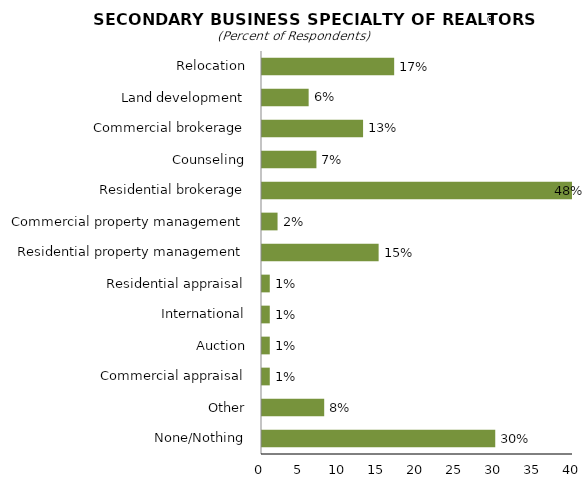
| Category | Series 0 |
|---|---|
| Relocation | 17 |
| Land development | 6 |
| Commercial brokerage | 13 |
| Counseling | 7 |
| Residential brokerage | 48 |
| Commercial property management | 2 |
| Residential property management | 15 |
| Residential appraisal | 1 |
| International | 1 |
| Auction | 1 |
| Commercial appraisal | 1 |
| Other | 8 |
| None/Nothing | 30 |